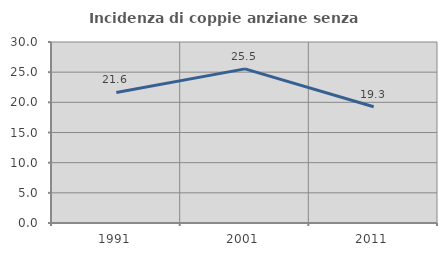
| Category | Incidenza di coppie anziane senza figli  |
|---|---|
| 1991.0 | 21.637 |
| 2001.0 | 25.547 |
| 2011.0 | 19.266 |